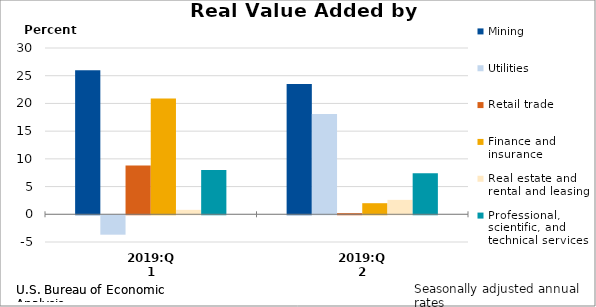
| Category | Mining | Utilities | Retail trade | Finance and insurance | Real estate and rental and leasing | Professional, scientific, and technical services |
|---|---|---|---|---|---|---|
| 2019:Q1 | 26 | -3.5 | 8.8 | 20.9 | 0.8 | 8 |
| 2019:Q2 | 23.5 | 18.1 | 0.2 | 2 | 2.6 | 7.4 |